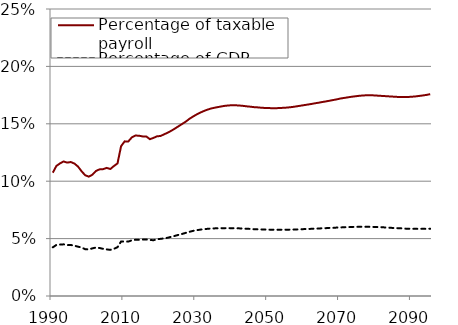
| Category | Percentage of taxable payroll | Percentage of GDP |
|---|---|---|
| 1990.0 | 0.107 | 0.042 |
| 1991.0 | 0.113 | 0.044 |
| 1992.0 | 0.115 | 0.045 |
| 1993.0 | 0.117 | 0.045 |
| 1994.0 | 0.116 | 0.044 |
| 1995.0 | 0.117 | 0.044 |
| 1996.0 | 0.115 | 0.044 |
| 1997.0 | 0.113 | 0.043 |
| 1998.0 | 0.109 | 0.042 |
| 1999.0 | 0.105 | 0.041 |
| 2000.0 | 0.104 | 0.04 |
| 2001.0 | 0.106 | 0.042 |
| 2002.0 | 0.109 | 0.042 |
| 2003.0 | 0.11 | 0.042 |
| 2004.0 | 0.11 | 0.041 |
| 2005.0 | 0.112 | 0.041 |
| 2006.0 | 0.111 | 0.04 |
| 2007.0 | 0.113 | 0.041 |
| 2008.0 | 0.115 | 0.042 |
| 2009.0 | 0.13 | 0.048 |
| 2010.0 | 0.135 | 0.048 |
| 2011.0 | 0.135 | 0.047 |
| 2012.0 | 0.138 | 0.048 |
| 2013.0 | 0.14 | 0.049 |
| 2014.0 | 0.14 | 0.049 |
| 2015.0 | 0.139 | 0.049 |
| 2016.0 | 0.139 | 0.049 |
| 2017.0 | 0.137 | 0.049 |
| 2018.0 | 0.138 | 0.049 |
| 2019.0 | 0.139 | 0.049 |
| 2020.0 | 0.139 | 0.05 |
| 2021.0 | 0.141 | 0.05 |
| 2022.0 | 0.142 | 0.051 |
| 2023.0 | 0.144 | 0.052 |
| 2024.0 | 0.146 | 0.052 |
| 2025.0 | 0.148 | 0.053 |
| 2026.0 | 0.15 | 0.054 |
| 2027.0 | 0.152 | 0.055 |
| 2028.0 | 0.154 | 0.056 |
| 2029.0 | 0.156 | 0.057 |
| 2030.0 | 0.158 | 0.057 |
| 2031.0 | 0.16 | 0.058 |
| 2032.0 | 0.161 | 0.058 |
| 2033.0 | 0.162 | 0.058 |
| 2034.0 | 0.163 | 0.059 |
| 2035.0 | 0.164 | 0.059 |
| 2036.0 | 0.165 | 0.059 |
| 2037.0 | 0.165 | 0.059 |
| 2038.0 | 0.166 | 0.059 |
| 2039.0 | 0.166 | 0.059 |
| 2040.0 | 0.166 | 0.059 |
| 2041.0 | 0.166 | 0.059 |
| 2042.0 | 0.166 | 0.059 |
| 2043.0 | 0.166 | 0.059 |
| 2044.0 | 0.165 | 0.059 |
| 2045.0 | 0.165 | 0.058 |
| 2046.0 | 0.164 | 0.058 |
| 2047.0 | 0.164 | 0.058 |
| 2048.0 | 0.164 | 0.058 |
| 2049.0 | 0.164 | 0.058 |
| 2050.0 | 0.164 | 0.058 |
| 2051.0 | 0.164 | 0.058 |
| 2052.0 | 0.164 | 0.058 |
| 2053.0 | 0.164 | 0.058 |
| 2054.0 | 0.164 | 0.058 |
| 2055.0 | 0.164 | 0.058 |
| 2056.0 | 0.164 | 0.058 |
| 2057.0 | 0.165 | 0.058 |
| 2058.0 | 0.165 | 0.058 |
| 2059.0 | 0.166 | 0.058 |
| 2060.0 | 0.166 | 0.058 |
| 2061.0 | 0.167 | 0.058 |
| 2062.0 | 0.167 | 0.058 |
| 2063.0 | 0.168 | 0.059 |
| 2064.0 | 0.168 | 0.059 |
| 2065.0 | 0.169 | 0.059 |
| 2066.0 | 0.169 | 0.059 |
| 2067.0 | 0.17 | 0.059 |
| 2068.0 | 0.171 | 0.059 |
| 2069.0 | 0.171 | 0.06 |
| 2070.0 | 0.172 | 0.06 |
| 2071.0 | 0.172 | 0.06 |
| 2072.0 | 0.173 | 0.06 |
| 2073.0 | 0.174 | 0.06 |
| 2074.0 | 0.174 | 0.06 |
| 2075.0 | 0.174 | 0.06 |
| 2076.0 | 0.175 | 0.06 |
| 2077.0 | 0.175 | 0.06 |
| 2078.0 | 0.175 | 0.06 |
| 2079.0 | 0.175 | 0.06 |
| 2080.0 | 0.175 | 0.06 |
| 2081.0 | 0.174 | 0.06 |
| 2082.0 | 0.174 | 0.06 |
| 2083.0 | 0.174 | 0.06 |
| 2084.0 | 0.174 | 0.059 |
| 2085.0 | 0.174 | 0.059 |
| 2086.0 | 0.173 | 0.059 |
| 2087.0 | 0.173 | 0.059 |
| 2088.0 | 0.173 | 0.059 |
| 2089.0 | 0.173 | 0.059 |
| 2090.0 | 0.174 | 0.058 |
| 2091.0 | 0.174 | 0.058 |
| 2092.0 | 0.174 | 0.058 |
| 2093.0 | 0.175 | 0.058 |
| 2094.0 | 0.175 | 0.058 |
| 2095.0 | 0.176 | 0.059 |